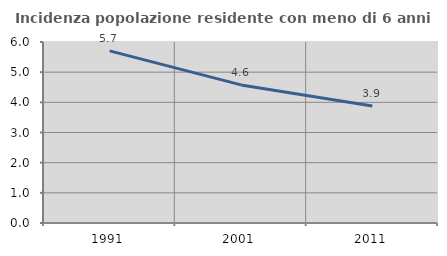
| Category | Incidenza popolazione residente con meno di 6 anni |
|---|---|
| 1991.0 | 5.705 |
| 2001.0 | 4.578 |
| 2011.0 | 3.88 |